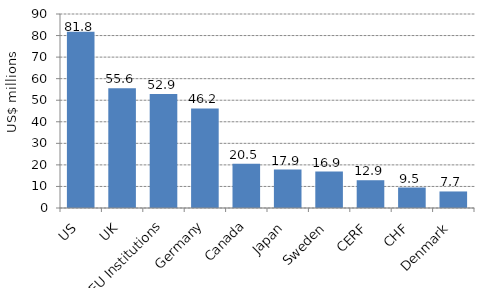
| Category | Series 0 |
|---|---|
| US | 81.785 |
| UK | 55.554 |
| EU Institutions | 52.899 |
| Germany | 46.185 |
| Canada | 20.528 |
| Japan | 17.852 |
| Sweden | 16.909 |
| CERF | 12.885 |
| CHF | 9.509 |
| Denmark | 7.675 |